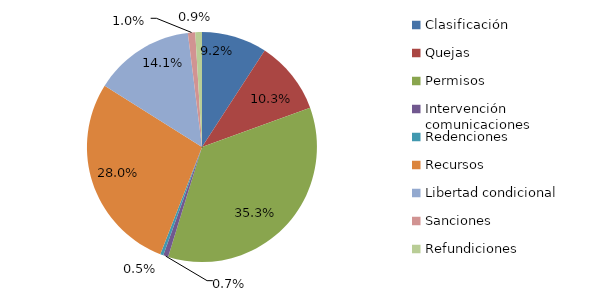
| Category | Series 0 |
|---|---|
| Clasificación | 560 |
| Quejas | 628 |
| Permisos | 2153 |
| Intervención comunicaciones | 43 |
| Redenciones | 27 |
| Recursos | 1710 |
| Libertad condicional | 860 |
| Sanciones | 63 |
| Refundiciones | 57 |